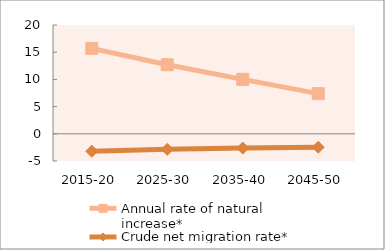
| Category | Annual rate of natural increase* | Crude net migration rate* |
|---|---|---|
| 2015-20 | 15.706 | -3.198 |
| 2025-30 | 12.701 | -2.86 |
| 2035-40 | 10.01 | -2.625 |
| 2045-50 | 7.386 | -2.468 |